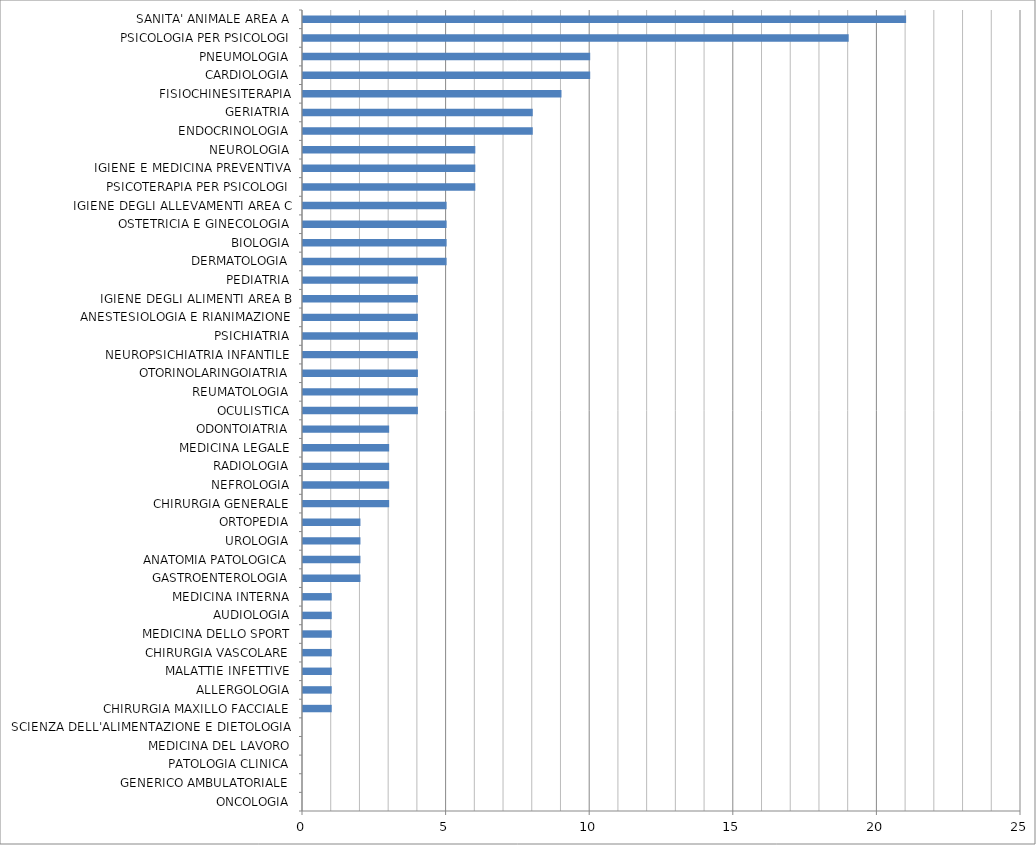
| Category | Series 0 |
|---|---|
| ONCOLOGIA | 0 |
| GENERICO AMBULATORIALE | 0 |
| PATOLOGIA CLINICA | 0 |
| MEDICINA DEL LAVORO | 0 |
| SCIENZA DELL'ALIMENTAZIONE E DIETOLOGIA | 0 |
| CHIRURGIA MAXILLO FACCIALE | 1 |
| ALLERGOLOGIA | 1 |
| MALATTIE INFETTIVE | 1 |
| CHIRURGIA VASCOLARE | 1 |
| MEDICINA DELLO SPORT | 1 |
| AUDIOLOGIA | 1 |
| MEDICINA INTERNA | 1 |
| GASTROENTEROLOGIA | 2 |
| ANATOMIA PATOLOGICA | 2 |
| UROLOGIA | 2 |
| ORTOPEDIA | 2 |
| CHIRURGIA GENERALE | 3 |
| NEFROLOGIA | 3 |
| RADIOLOGIA | 3 |
| MEDICINA LEGALE | 3 |
| ODONTOIATRIA | 3 |
| OCULISTICA | 4 |
| REUMATOLOGIA | 4 |
| OTORINOLARINGOIATRIA | 4 |
| NEUROPSICHIATRIA INFANTILE | 4 |
| PSICHIATRIA | 4 |
| ANESTESIOLOGIA E RIANIMAZIONE | 4 |
| IGIENE DEGLI ALIMENTI AREA B | 4 |
| PEDIATRIA | 4 |
| DERMATOLOGIA | 5 |
| BIOLOGIA | 5 |
| OSTETRICIA E GINECOLOGIA | 5 |
| IGIENE DEGLI ALLEVAMENTI AREA C | 5 |
| PSICOTERAPIA PER PSICOLOGI | 6 |
| IGIENE E MEDICINA PREVENTIVA | 6 |
| NEUROLOGIA | 6 |
| ENDOCRINOLOGIA | 8 |
| GERIATRIA | 8 |
| FISIOCHINESITERAPIA | 9 |
| CARDIOLOGIA | 10 |
| PNEUMOLOGIA | 10 |
| PSICOLOGIA PER PSICOLOGI | 19 |
| SANITA' ANIMALE AREA A | 21 |